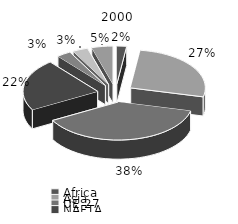
| Category | 2000 |
|---|---|
| Africa | 2.111 |
| Asia | 26.677 |
| UE 27 | 38.183 |
| NAFTA | 22.067 |
| Sud-Centro America | 3.074 |
| Medio oriente | 3.303 |
| Altri | 4.585 |